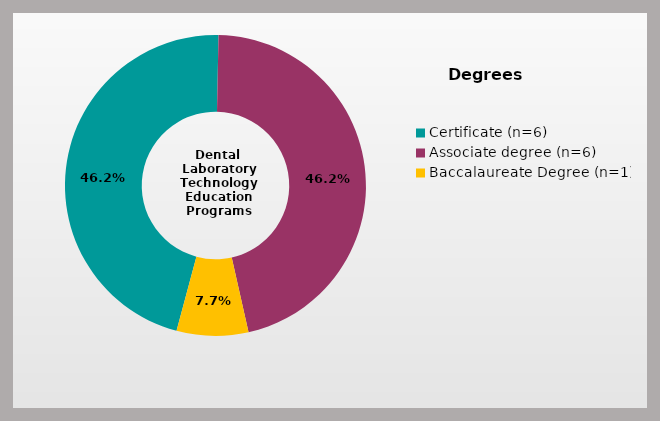
| Category | Series 0 |
|---|---|
| Certificate (n=6) | 0.462 |
| Associate degree (n=6) | 0.462 |
| Baccalaureate Degree (n=1) | 0.077 |